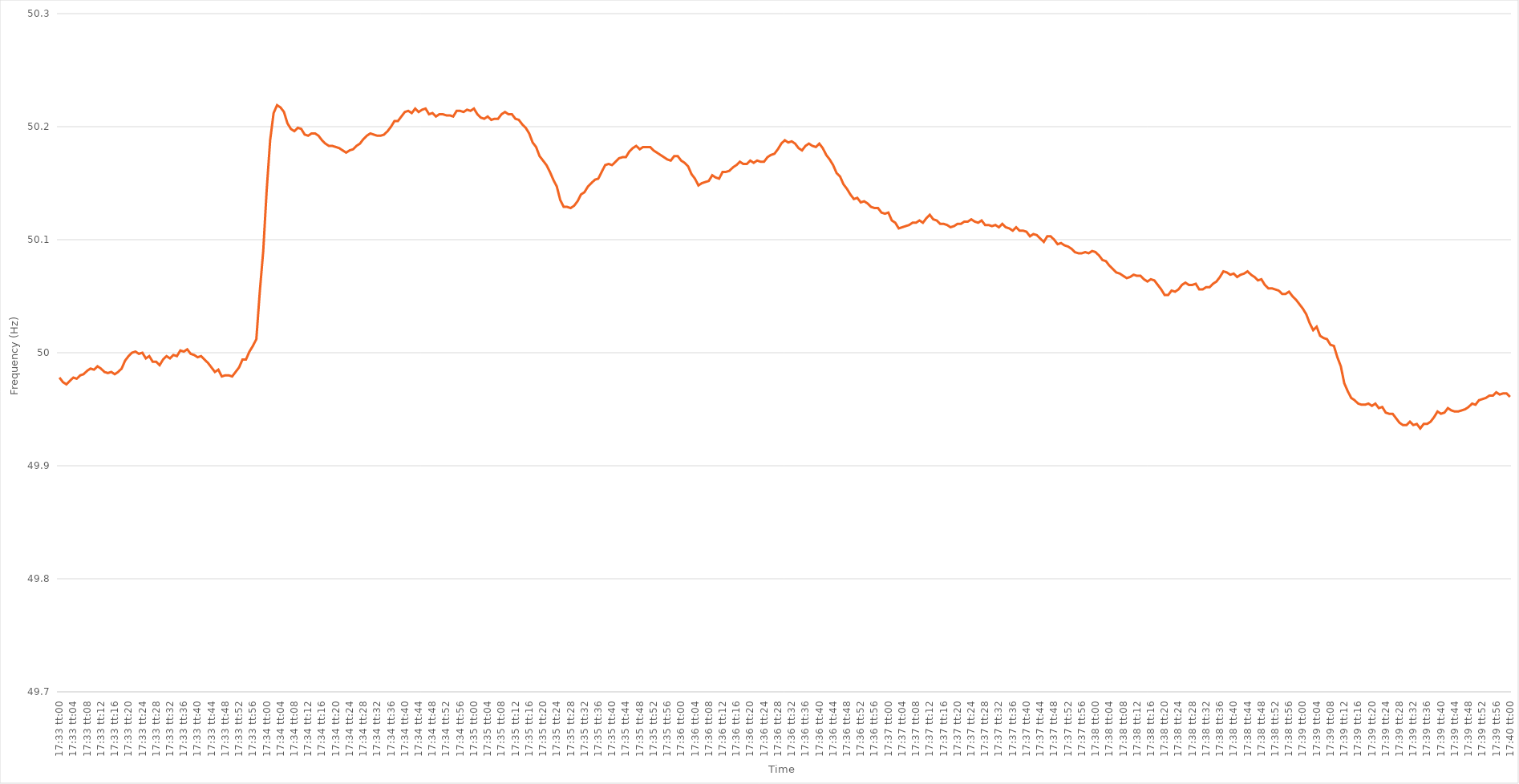
| Category | Series 0 |
|---|---|
| 0.7312500000000001 | 49.978 |
| 0.7312615740740741 | 49.974 |
| 0.7312731481481481 | 49.972 |
| 0.7312847222222222 | 49.975 |
| 0.7312962962962963 | 49.978 |
| 0.7313078703703703 | 49.977 |
| 0.7313194444444444 | 49.98 |
| 0.7313310185185186 | 49.981 |
| 0.7313425925925926 | 49.984 |
| 0.7313541666666666 | 49.986 |
| 0.7313657407407407 | 49.985 |
| 0.7313773148148148 | 49.988 |
| 0.731388888888889 | 49.986 |
| 0.7314004629629629 | 49.983 |
| 0.731412037037037 | 49.982 |
| 0.7314236111111111 | 49.983 |
| 0.7314351851851852 | 49.981 |
| 0.7314467592592592 | 49.983 |
| 0.7314583333333333 | 49.986 |
| 0.7314699074074075 | 49.993 |
| 0.7314814814814815 | 49.997 |
| 0.7314930555555555 | 50 |
| 0.7315046296296296 | 50.001 |
| 0.7315162037037037 | 49.999 |
| 0.7315277777777777 | 50 |
| 0.7315393518518518 | 49.995 |
| 0.731550925925926 | 49.997 |
| 0.7315625 | 49.992 |
| 0.731574074074074 | 49.992 |
| 0.7315856481481481 | 49.989 |
| 0.7315972222222222 | 49.994 |
| 0.7316087962962964 | 49.997 |
| 0.7316203703703703 | 49.995 |
| 0.7316319444444445 | 49.998 |
| 0.7316435185185185 | 49.997 |
| 0.7316550925925926 | 50.002 |
| 0.7316666666666666 | 50.001 |
| 0.7316782407407407 | 50.003 |
| 0.7316898148148149 | 49.999 |
| 0.7317013888888889 | 49.998 |
| 0.731712962962963 | 49.996 |
| 0.731724537037037 | 49.997 |
| 0.7317361111111111 | 49.994 |
| 0.7317476851851853 | 49.991 |
| 0.7317592592592592 | 49.987 |
| 0.7317708333333334 | 49.983 |
| 0.7317824074074074 | 49.985 |
| 0.7317939814814814 | 49.979 |
| 0.7318055555555555 | 49.98 |
| 0.7318171296296296 | 49.98 |
| 0.7318287037037038 | 49.979 |
| 0.7318402777777777 | 49.983 |
| 0.7318518518518519 | 49.987 |
| 0.7318634259259259 | 49.994 |
| 0.731875 | 49.994 |
| 0.731886574074074 | 50.001 |
| 0.7318981481481481 | 50.006 |
| 0.7319097222222223 | 50.012 |
| 0.7319212962962963 | 50.054 |
| 0.7319328703703704 | 50.09 |
| 0.7319444444444444 | 50.144 |
| 0.7319560185185185 | 50.188 |
| 0.7319675925925927 | 50.212 |
| 0.7319791666666666 | 50.219 |
| 0.7319907407407408 | 50.217 |
| 0.7320023148148148 | 50.213 |
| 0.732013888888889 | 50.203 |
| 0.7320254629629629 | 50.198 |
| 0.732037037037037 | 50.196 |
| 0.7320486111111112 | 50.199 |
| 0.7320601851851851 | 50.198 |
| 0.7320717592592593 | 50.193 |
| 0.7320833333333333 | 50.192 |
| 0.7320949074074075 | 50.194 |
| 0.7321064814814814 | 50.194 |
| 0.7321180555555555 | 50.192 |
| 0.7321296296296297 | 50.188 |
| 0.7321412037037037 | 50.185 |
| 0.7321527777777778 | 50.183 |
| 0.7321643518518518 | 50.183 |
| 0.732175925925926 | 50.182 |
| 0.7321875000000001 | 50.181 |
| 0.732199074074074 | 50.179 |
| 0.7322106481481482 | 50.177 |
| 0.7322222222222222 | 50.179 |
| 0.7322337962962964 | 50.18 |
| 0.7322453703703703 | 50.183 |
| 0.7322569444444444 | 50.185 |
| 0.7322685185185186 | 50.189 |
| 0.7322800925925925 | 50.192 |
| 0.7322916666666667 | 50.194 |
| 0.7323032407407407 | 50.193 |
| 0.7323148148148149 | 50.192 |
| 0.7323263888888888 | 50.192 |
| 0.7323379629629629 | 50.193 |
| 0.7323495370370371 | 50.196 |
| 0.7323611111111111 | 50.2 |
| 0.7323726851851852 | 50.205 |
| 0.7323842592592592 | 50.205 |
| 0.7323958333333334 | 50.209 |
| 0.7324074074074075 | 50.213 |
| 0.7324189814814814 | 50.214 |
| 0.7324305555555556 | 50.212 |
| 0.7324421296296296 | 50.216 |
| 0.7324537037037038 | 50.213 |
| 0.7324652777777777 | 50.215 |
| 0.7324768518518519 | 50.216 |
| 0.732488425925926 | 50.211 |
| 0.7324999999999999 | 50.212 |
| 0.7325115740740741 | 50.209 |
| 0.7325231481481481 | 50.211 |
| 0.7325347222222223 | 50.211 |
| 0.7325462962962962 | 50.21 |
| 0.7325578703703703 | 50.21 |
| 0.7325694444444445 | 50.209 |
| 0.7325810185185185 | 50.214 |
| 0.7325925925925926 | 50.214 |
| 0.7326041666666666 | 50.213 |
| 0.7326157407407408 | 50.215 |
| 0.7326273148148149 | 50.214 |
| 0.7326388888888888 | 50.216 |
| 0.732650462962963 | 50.211 |
| 0.732662037037037 | 50.208 |
| 0.7326736111111112 | 50.207 |
| 0.7326851851851851 | 50.209 |
| 0.7326967592592593 | 50.206 |
| 0.7327083333333334 | 50.207 |
| 0.7327199074074073 | 50.207 |
| 0.7327314814814815 | 50.211 |
| 0.7327430555555555 | 50.213 |
| 0.7327546296296297 | 50.211 |
| 0.7327662037037036 | 50.211 |
| 0.7327777777777778 | 50.207 |
| 0.7327893518518519 | 50.206 |
| 0.7328009259259259 | 50.202 |
| 0.7328125 | 50.199 |
| 0.732824074074074 | 50.194 |
| 0.7328356481481482 | 50.186 |
| 0.7328472222222223 | 50.182 |
| 0.7328587962962962 | 50.174 |
| 0.7328703703703704 | 50.17 |
| 0.7328819444444444 | 50.166 |
| 0.7328935185185186 | 50.16 |
| 0.7329050925925925 | 50.153 |
| 0.7329166666666667 | 50.147 |
| 0.7329282407407408 | 50.135 |
| 0.7329398148148147 | 50.129 |
| 0.7329513888888889 | 50.129 |
| 0.7329629629629629 | 50.128 |
| 0.7329745370370371 | 50.13 |
| 0.732986111111111 | 50.134 |
| 0.7329976851851852 | 50.14 |
| 0.7330092592592593 | 50.142 |
| 0.7330208333333333 | 50.147 |
| 0.7330324074074074 | 50.15 |
| 0.7330439814814814 | 50.153 |
| 0.7330555555555556 | 50.154 |
| 0.7330671296296297 | 50.16 |
| 0.7330787037037036 | 50.166 |
| 0.7330902777777778 | 50.167 |
| 0.7331018518518518 | 50.166 |
| 0.733113425925926 | 50.169 |
| 0.7331249999999999 | 50.172 |
| 0.7331365740740741 | 50.173 |
| 0.7331481481481482 | 50.173 |
| 0.7331597222222223 | 50.178 |
| 0.7331712962962963 | 50.181 |
| 0.7331828703703703 | 50.183 |
| 0.7331944444444445 | 50.18 |
| 0.7332060185185186 | 50.182 |
| 0.7332175925925926 | 50.182 |
| 0.7332291666666667 | 50.182 |
| 0.7332407407407407 | 50.179 |
| 0.7332523148148148 | 50.177 |
| 0.7332638888888888 | 50.175 |
| 0.733275462962963 | 50.173 |
| 0.7332870370370371 | 50.171 |
| 0.733298611111111 | 50.17 |
| 0.7333101851851852 | 50.174 |
| 0.7333217592592592 | 50.174 |
| 0.7333333333333334 | 50.17 |
| 0.7333449074074073 | 50.168 |
| 0.7333564814814815 | 50.165 |
| 0.7333680555555556 | 50.158 |
| 0.7333796296296297 | 50.154 |
| 0.7333912037037037 | 50.148 |
| 0.7334027777777777 | 50.15 |
| 0.7334143518518519 | 50.151 |
| 0.733425925925926 | 50.152 |
| 0.7334375 | 50.157 |
| 0.7334490740740741 | 50.155 |
| 0.7334606481481482 | 50.154 |
| 0.7334722222222222 | 50.16 |
| 0.7334837962962962 | 50.16 |
| 0.7334953703703704 | 50.161 |
| 0.7335069444444445 | 50.164 |
| 0.7335185185185185 | 50.166 |
| 0.7335300925925926 | 50.169 |
| 0.7335416666666666 | 50.167 |
| 0.7335532407407408 | 50.167 |
| 0.7335648148148147 | 50.17 |
| 0.7335763888888889 | 50.168 |
| 0.733587962962963 | 50.17 |
| 0.7335995370370371 | 50.169 |
| 0.7336111111111111 | 50.169 |
| 0.7336226851851851 | 50.173 |
| 0.7336342592592593 | 50.175 |
| 0.7336458333333334 | 50.176 |
| 0.7336574074074074 | 50.18 |
| 0.7336689814814815 | 50.185 |
| 0.7336805555555556 | 50.188 |
| 0.7336921296296296 | 50.186 |
| 0.7337037037037036 | 50.187 |
| 0.7337152777777778 | 50.185 |
| 0.7337268518518519 | 50.181 |
| 0.7337384259259259 | 50.179 |
| 0.73375 | 50.183 |
| 0.733761574074074 | 50.185 |
| 0.7337731481481482 | 50.183 |
| 0.7337847222222221 | 50.182 |
| 0.7337962962962963 | 50.185 |
| 0.7338078703703704 | 50.181 |
| 0.7338194444444445 | 50.175 |
| 0.7338310185185185 | 50.171 |
| 0.7338425925925925 | 50.166 |
| 0.7338541666666667 | 50.159 |
| 0.7338657407407408 | 50.156 |
| 0.7338773148148148 | 50.149 |
| 0.7338888888888889 | 50.145 |
| 0.733900462962963 | 50.14 |
| 0.733912037037037 | 50.136 |
| 0.733923611111111 | 50.137 |
| 0.7339351851851852 | 50.133 |
| 0.7339467592592593 | 50.134 |
| 0.7339583333333333 | 50.132 |
| 0.7339699074074074 | 50.129 |
| 0.7339814814814815 | 50.128 |
| 0.7339930555555556 | 50.128 |
| 0.7340046296296295 | 50.124 |
| 0.7340162037037037 | 50.123 |
| 0.7340277777777778 | 50.124 |
| 0.7340393518518519 | 50.117 |
| 0.7340509259259259 | 50.115 |
| 0.7340625 | 50.11 |
| 0.7340740740740741 | 50.111 |
| 0.7340856481481483 | 50.112 |
| 0.7340972222222222 | 50.113 |
| 0.7341087962962963 | 50.115 |
| 0.7341203703703704 | 50.115 |
| 0.7341319444444444 | 50.117 |
| 0.7341435185185184 | 50.115 |
| 0.7341550925925926 | 50.119 |
| 0.7341666666666667 | 50.122 |
| 0.7341782407407407 | 50.118 |
| 0.7341898148148148 | 50.117 |
| 0.7342013888888889 | 50.114 |
| 0.734212962962963 | 50.114 |
| 0.7342245370370369 | 50.113 |
| 0.7342361111111111 | 50.111 |
| 0.7342476851851852 | 50.112 |
| 0.7342592592592593 | 50.114 |
| 0.7342708333333333 | 50.114 |
| 0.7342824074074074 | 50.116 |
| 0.7342939814814815 | 50.116 |
| 0.7343055555555557 | 50.118 |
| 0.7343171296296296 | 50.116 |
| 0.7343287037037037 | 50.115 |
| 0.7343402777777778 | 50.117 |
| 0.7343518518518519 | 50.113 |
| 0.7343634259259259 | 50.113 |
| 0.734375 | 50.112 |
| 0.7343865740740741 | 50.113 |
| 0.7343981481481481 | 50.111 |
| 0.7344097222222222 | 50.114 |
| 0.7344212962962963 | 50.111 |
| 0.7344328703703704 | 50.11 |
| 0.7344444444444443 | 50.108 |
| 0.7344560185185185 | 50.111 |
| 0.7344675925925926 | 50.108 |
| 0.7344791666666667 | 50.108 |
| 0.7344907407407407 | 50.107 |
| 0.7345023148148148 | 50.103 |
| 0.7345138888888889 | 50.105 |
| 0.7345254629629631 | 50.104 |
| 0.734537037037037 | 50.101 |
| 0.7345486111111111 | 50.098 |
| 0.7345601851851852 | 50.103 |
| 0.7345717592592593 | 50.103 |
| 0.7345833333333333 | 50.1 |
| 0.7345949074074074 | 50.096 |
| 0.7346064814814816 | 50.097 |
| 0.7346180555555556 | 50.095 |
| 0.7346296296296296 | 50.094 |
| 0.7346412037037037 | 50.092 |
| 0.7346527777777778 | 50.089 |
| 0.7346643518518517 | 50.088 |
| 0.7346759259259259 | 50.088 |
| 0.7346875 | 50.089 |
| 0.7346990740740741 | 50.088 |
| 0.7347106481481481 | 50.09 |
| 0.7347222222222222 | 50.089 |
| 0.7347337962962963 | 50.086 |
| 0.7347453703703705 | 50.082 |
| 0.7347569444444444 | 50.081 |
| 0.7347685185185185 | 50.077 |
| 0.7347800925925926 | 50.074 |
| 0.7347916666666667 | 50.071 |
| 0.7348032407407407 | 50.07 |
| 0.7348148148148148 | 50.068 |
| 0.734826388888889 | 50.066 |
| 0.734837962962963 | 50.067 |
| 0.734849537037037 | 50.069 |
| 0.7348611111111111 | 50.068 |
| 0.7348726851851852 | 50.068 |
| 0.7348842592592592 | 50.065 |
| 0.7348958333333333 | 50.063 |
| 0.7349074074074075 | 50.065 |
| 0.7349189814814815 | 50.064 |
| 0.7349305555555555 | 50.06 |
| 0.7349421296296296 | 50.056 |
| 0.7349537037037037 | 50.051 |
| 0.7349652777777779 | 50.051 |
| 0.7349768518518518 | 50.055 |
| 0.734988425925926 | 50.054 |
| 0.735 | 50.056 |
| 0.7350115740740741 | 50.06 |
| 0.7350231481481481 | 50.062 |
| 0.7350347222222222 | 50.06 |
| 0.7350462962962964 | 50.06 |
| 0.7350578703703704 | 50.061 |
| 0.7350694444444444 | 50.056 |
| 0.7350810185185185 | 50.056 |
| 0.7350925925925926 | 50.058 |
| 0.7351041666666666 | 50.058 |
| 0.7351157407407407 | 50.061 |
| 0.7351273148148149 | 50.063 |
| 0.7351388888888889 | 50.067 |
| 0.7351504629629629 | 50.072 |
| 0.735162037037037 | 50.071 |
| 0.7351736111111111 | 50.069 |
| 0.7351851851851853 | 50.07 |
| 0.7351967592592592 | 50.067 |
| 0.7352083333333334 | 50.069 |
| 0.7352199074074074 | 50.07 |
| 0.7352314814814815 | 50.072 |
| 0.7352430555555555 | 50.069 |
| 0.7352546296296296 | 50.067 |
| 0.7352662037037038 | 50.064 |
| 0.7352777777777778 | 50.065 |
| 0.7352893518518518 | 50.06 |
| 0.7353009259259259 | 50.057 |
| 0.7353125 | 50.057 |
| 0.735324074074074 | 50.056 |
| 0.7353356481481481 | 50.055 |
| 0.7353472222222223 | 50.052 |
| 0.7353587962962963 | 50.052 |
| 0.7353703703703703 | 50.054 |
| 0.7353819444444444 | 50.05 |
| 0.7353935185185185 | 50.047 |
| 0.7354050925925927 | 50.043 |
| 0.7354166666666666 | 50.039 |
| 0.7354282407407408 | 50.034 |
| 0.7354398148148148 | 50.026 |
| 0.735451388888889 | 50.02 |
| 0.7354629629629629 | 50.023 |
| 0.735474537037037 | 50.015 |
| 0.7354861111111112 | 50.013 |
| 0.7354976851851852 | 50.012 |
| 0.7355092592592593 | 50.007 |
| 0.7355208333333333 | 50.006 |
| 0.7355324074074074 | 49.996 |
| 0.7355439814814814 | 49.988 |
| 0.7355555555555555 | 49.973 |
| 0.7355671296296297 | 49.966 |
| 0.7355787037037037 | 49.96 |
| 0.7355902777777777 | 49.958 |
| 0.7356018518518518 | 49.955 |
| 0.7356134259259259 | 49.954 |
| 0.7356250000000001 | 49.954 |
| 0.735636574074074 | 49.955 |
| 0.7356481481481482 | 49.953 |
| 0.7356597222222222 | 49.955 |
| 0.7356712962962964 | 49.951 |
| 0.7356828703703703 | 49.952 |
| 0.7356944444444444 | 49.947 |
| 0.7357060185185186 | 49.946 |
| 0.7357175925925926 | 49.946 |
| 0.7357291666666667 | 49.942 |
| 0.7357407407407407 | 49.938 |
| 0.7357523148148148 | 49.936 |
| 0.735763888888889 | 49.936 |
| 0.7357754629629629 | 49.939 |
| 0.7357870370370371 | 49.936 |
| 0.7357986111111111 | 49.937 |
| 0.7358101851851853 | 49.933 |
| 0.7358217592592592 | 49.937 |
| 0.7358333333333333 | 49.937 |
| 0.7358449074074075 | 49.939 |
| 0.7358564814814814 | 49.943 |
| 0.7358680555555556 | 49.948 |
| 0.7358796296296296 | 49.946 |
| 0.7358912037037038 | 49.947 |
| 0.7359027777777777 | 49.951 |
| 0.7359143518518518 | 49.949 |
| 0.735925925925926 | 49.948 |
| 0.7359375 | 49.948 |
| 0.7359490740740741 | 49.949 |
| 0.7359606481481481 | 49.95 |
| 0.7359722222222222 | 49.952 |
| 0.7359837962962964 | 49.955 |
| 0.7359953703703703 | 49.954 |
| 0.7360069444444445 | 49.958 |
| 0.7360185185185185 | 49.959 |
| 0.7360300925925927 | 49.96 |
| 0.7360416666666666 | 49.962 |
| 0.7360532407407407 | 49.962 |
| 0.7360648148148149 | 49.965 |
| 0.7360763888888888 | 49.963 |
| 0.736087962962963 | 49.964 |
| 0.736099537037037 | 49.964 |
| 0.7361111111111112 | 49.961 |